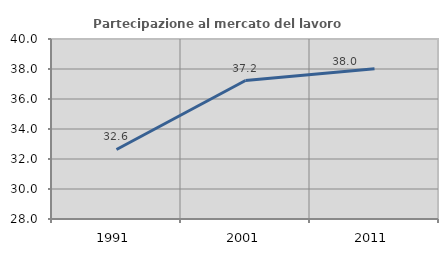
| Category | Partecipazione al mercato del lavoro  femminile |
|---|---|
| 1991.0 | 32.636 |
| 2001.0 | 37.23 |
| 2011.0 | 38.017 |